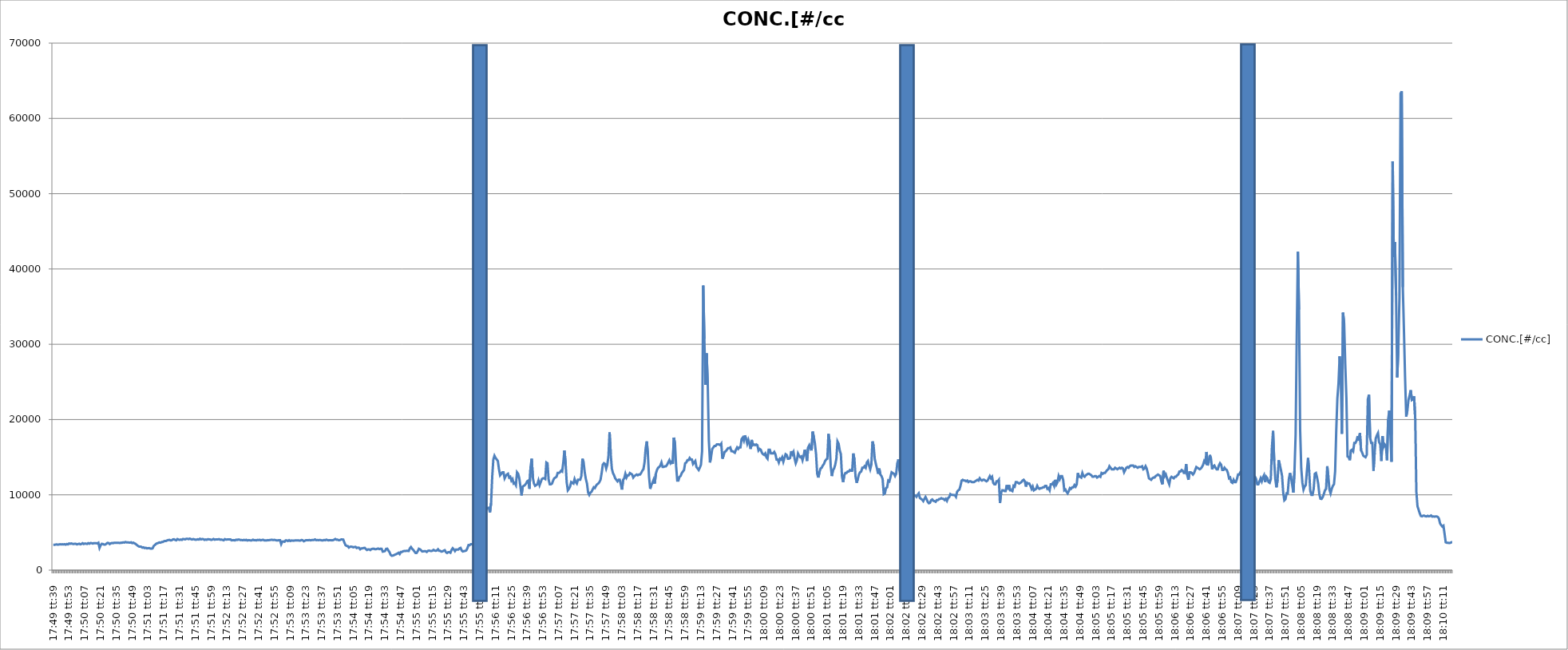
| Category | CONC.[#/cc] |
|---|---|
| 0.7428125 | 3360 |
| 0.7428240740740741 | 3360 |
| 0.7428356481481481 | 3400 |
| 0.7428472222222222 | 3420 |
| 0.7428587962962964 | 3380 |
| 0.7428703703703704 | 3410 |
| 0.7428819444444444 | 3440 |
| 0.7428935185185185 | 3420 |
| 0.7429050925925926 | 3440 |
| 0.7429166666666666 | 3410 |
| 0.7429282407407407 | 3450 |
| 0.7429398148148149 | 3390 |
| 0.7429513888888889 | 3470 |
| 0.7429629629629629 | 3420 |
| 0.742974537037037 | 3540 |
| 0.7429861111111111 | 3500 |
| 0.7429976851851853 | 3550 |
| 0.7430092592592592 | 3500 |
| 0.7430208333333334 | 3470 |
| 0.7430324074074074 | 3500 |
| 0.7430439814814815 | 3500 |
| 0.7430555555555555 | 3420 |
| 0.7430671296296296 | 3470 |
| 0.7430787037037038 | 3510 |
| 0.7430902777777778 | 3430 |
| 0.7431018518518518 | 3480 |
| 0.7431134259259259 | 3580 |
| 0.743125 | 3470 |
| 0.743136574074074 | 3540 |
| 0.7431481481481481 | 3510 |
| 0.7431597222222223 | 3480 |
| 0.7431712962962963 | 3590 |
| 0.7431828703703703 | 3510 |
| 0.7431944444444444 | 3600 |
| 0.7432060185185185 | 3590 |
| 0.7432175925925927 | 3530 |
| 0.7432291666666666 | 3590 |
| 0.7432407407407408 | 3570 |
| 0.7432523148148148 | 3580 |
| 0.743263888888889 | 3550 |
| 0.7432754629629629 | 3640 |
| 0.743287037037037 | 2960 |
| 0.7432986111111112 | 3310 |
| 0.7433101851851852 | 3500 |
| 0.7433217592592593 | 3470 |
| 0.7433333333333333 | 3400 |
| 0.7433449074074074 | 3400 |
| 0.7433564814814814 | 3490 |
| 0.7433680555555555 | 3620 |
| 0.7433796296296297 | 3610 |
| 0.7433912037037037 | 3460 |
| 0.7434027777777777 | 3560 |
| 0.7434143518518518 | 3610 |
| 0.7434259259259259 | 3580 |
| 0.7434375000000001 | 3640 |
| 0.743449074074074 | 3620 |
| 0.7434606481481482 | 3640 |
| 0.7434722222222222 | 3620 |
| 0.7434837962962964 | 3640 |
| 0.7434953703703703 | 3600 |
| 0.7435069444444444 | 3650 |
| 0.7435185185185186 | 3640 |
| 0.7435300925925926 | 3690 |
| 0.7435416666666667 | 3660 |
| 0.7435532407407407 | 3740 |
| 0.7435648148148148 | 3690 |
| 0.743576388888889 | 3690 |
| 0.7435879629629629 | 3670 |
| 0.7435995370370371 | 3650 |
| 0.7436111111111111 | 3700 |
| 0.7436226851851853 | 3590 |
| 0.7436342592592592 | 3650 |
| 0.7436458333333333 | 3560 |
| 0.7436574074074075 | 3490 |
| 0.7436689814814814 | 3350 |
| 0.7436805555555556 | 3230 |
| 0.7436921296296296 | 3140 |
| 0.7437037037037038 | 3130 |
| 0.7437152777777777 | 3100 |
| 0.7437268518518518 | 2990 |
| 0.743738425925926 | 3030 |
| 0.74375 | 2930 |
| 0.7437615740740741 | 2970 |
| 0.7437731481481481 | 2890 |
| 0.7437847222222222 | 2920 |
| 0.7437962962962964 | 2930 |
| 0.7438078703703703 | 2870 |
| 0.7438194444444445 | 2850 |
| 0.7438310185185185 | 2890 |
| 0.7438425925925927 | 3200 |
| 0.7438541666666666 | 3340 |
| 0.7438657407407407 | 3490 |
| 0.7438773148148149 | 3560 |
| 0.7438888888888888 | 3610 |
| 0.743900462962963 | 3680 |
| 0.743912037037037 | 3650 |
| 0.7439236111111112 | 3730 |
| 0.7439351851851851 | 3740 |
| 0.7439467592592592 | 3830 |
| 0.7439583333333334 | 3880 |
| 0.7439699074074074 | 3880 |
| 0.7439814814814815 | 3960 |
| 0.7439930555555555 | 4000 |
| 0.7440046296296297 | 4020 |
| 0.7440162037037038 | 3950 |
| 0.7440277777777777 | 3970 |
| 0.7440393518518519 | 4080 |
| 0.7440509259259259 | 4100 |
| 0.7440625000000001 | 4010 |
| 0.744074074074074 | 3960 |
| 0.7440856481481481 | 4130 |
| 0.7440972222222223 | 4060 |
| 0.7441087962962962 | 4020 |
| 0.7441203703703704 | 4070 |
| 0.7441319444444444 | 4020 |
| 0.7441435185185186 | 4140 |
| 0.7441550925925925 | 4110 |
| 0.7441666666666666 | 4090 |
| 0.7441782407407408 | 4170 |
| 0.7441898148148148 | 4160 |
| 0.7442013888888889 | 4120 |
| 0.7442129629629629 | 4190 |
| 0.7442245370370371 | 4120 |
| 0.7442361111111112 | 4070 |
| 0.7442476851851851 | 4130 |
| 0.7442592592592593 | 4090 |
| 0.7442708333333333 | 4040 |
| 0.7442824074074075 | 4050 |
| 0.7442939814814814 | 4100 |
| 0.7443055555555556 | 4060 |
| 0.7443171296296297 | 4170 |
| 0.7443287037037036 | 4080 |
| 0.7443402777777778 | 4130 |
| 0.7443518518518518 | 4120 |
| 0.744363425925926 | 4020 |
| 0.7443749999999999 | 4070 |
| 0.744386574074074 | 4030 |
| 0.7443981481481482 | 4110 |
| 0.7444097222222222 | 4090 |
| 0.7444212962962963 | 4080 |
| 0.7444328703703703 | 4020 |
| 0.7444444444444445 | 4060 |
| 0.7444560185185186 | 4140 |
| 0.7444675925925925 | 4050 |
| 0.7444791666666667 | 4080 |
| 0.7444907407407407 | 4070 |
| 0.7445023148148149 | 4090 |
| 0.7445138888888888 | 4120 |
| 0.744525462962963 | 4040 |
| 0.7445370370370371 | 4070 |
| 0.744548611111111 | 4020 |
| 0.7445601851851852 | 3970 |
| 0.7445717592592592 | 4120 |
| 0.7445833333333334 | 4070 |
| 0.7445949074074073 | 4070 |
| 0.7446064814814815 | 4090 |
| 0.7446180555555556 | 4070 |
| 0.7446296296296296 | 4090 |
| 0.7446412037037037 | 3960 |
| 0.7446527777777777 | 3970 |
| 0.7446643518518519 | 3990 |
| 0.744675925925926 | 3950 |
| 0.7446875 | 4040 |
| 0.7446990740740741 | 4010 |
| 0.7447106481481481 | 4070 |
| 0.7447222222222223 | 4050 |
| 0.7447337962962962 | 3990 |
| 0.7447453703703704 | 4000 |
| 0.7447569444444445 | 3970 |
| 0.7447685185185186 | 4020 |
| 0.7447800925925926 | 3970 |
| 0.7447916666666666 | 4030 |
| 0.7448032407407408 | 3940 |
| 0.7448148148148147 | 3990 |
| 0.7448263888888889 | 3970 |
| 0.744837962962963 | 3950 |
| 0.744849537037037 | 3960 |
| 0.7448611111111111 | 4040 |
| 0.7448726851851851 | 3970 |
| 0.7448842592592593 | 3990 |
| 0.7448958333333334 | 3950 |
| 0.7449074074074074 | 4020 |
| 0.7449189814814815 | 3990 |
| 0.7449305555555555 | 4030 |
| 0.7449421296296297 | 3960 |
| 0.7449537037037036 | 4010 |
| 0.7449652777777778 | 4030 |
| 0.7449768518518519 | 3950 |
| 0.744988425925926 | 3940 |
| 0.745 | 3940 |
| 0.745011574074074 | 3990 |
| 0.7450231481481482 | 3970 |
| 0.7450347222222223 | 4010 |
| 0.7450462962962963 | 4020 |
| 0.7450578703703704 | 4020 |
| 0.7450694444444445 | 4010 |
| 0.7450810185185185 | 4020 |
| 0.7450925925925925 | 3990 |
| 0.7451041666666667 | 3950 |
| 0.7451157407407408 | 3950 |
| 0.7451273148148148 | 3990 |
| 0.7451388888888889 | 3990 |
| 0.745150462962963 | 3460 |
| 0.7451620370370371 | 3790 |
| 0.745173611111111 | 3810 |
| 0.7451851851851852 | 3770 |
| 0.7451967592592593 | 3960 |
| 0.7452083333333334 | 3950 |
| 0.7452199074074074 | 3870 |
| 0.7452314814814814 | 3980 |
| 0.7452430555555556 | 3870 |
| 0.7452546296296297 | 3940 |
| 0.7452662037037037 | 3920 |
| 0.7452777777777778 | 3910 |
| 0.7452893518518519 | 3940 |
| 0.7453009259259259 | 3940 |
| 0.7453124999999999 | 3940 |
| 0.7453240740740741 | 3960 |
| 0.7453356481481482 | 3930 |
| 0.7453472222222222 | 3930 |
| 0.7453587962962963 | 4000 |
| 0.7453703703703703 | 3980 |
| 0.7453819444444445 | 3840 |
| 0.7453935185185184 | 3910 |
| 0.7454050925925926 | 3990 |
| 0.7454166666666667 | 3990 |
| 0.7454282407407408 | 3980 |
| 0.7454398148148148 | 4000 |
| 0.7454513888888888 | 3960 |
| 0.745462962962963 | 3990 |
| 0.7454745370370371 | 4000 |
| 0.7454861111111111 | 4010 |
| 0.7454976851851852 | 4080 |
| 0.7455092592592593 | 3980 |
| 0.7455208333333333 | 4000 |
| 0.7455324074074073 | 3980 |
| 0.7455439814814815 | 4010 |
| 0.7455555555555556 | 3990 |
| 0.7455671296296296 | 3950 |
| 0.7455787037037037 | 3950 |
| 0.7455902777777778 | 4010 |
| 0.7456018518518519 | 3970 |
| 0.7456134259259258 | 4050 |
| 0.745625 | 3990 |
| 0.7456365740740741 | 3960 |
| 0.7456481481481482 | 3980 |
| 0.7456597222222222 | 3990 |
| 0.7456712962962962 | 3960 |
| 0.7456828703703704 | 3980 |
| 0.7456944444444445 | 4050 |
| 0.7457060185185185 | 4140 |
| 0.7457175925925926 | 4040 |
| 0.7457291666666667 | 4050 |
| 0.7457407407407407 | 3970 |
| 0.7457523148148147 | 3990 |
| 0.7457638888888889 | 4070 |
| 0.745775462962963 | 4080 |
| 0.745787037037037 | 4060 |
| 0.7457986111111111 | 3660 |
| 0.7458101851851852 | 3320 |
| 0.7458217592592593 | 3220 |
| 0.7458333333333332 | 3190 |
| 0.7458449074074074 | 3000 |
| 0.7458564814814815 | 3110 |
| 0.7458680555555556 | 3120 |
| 0.7458796296296296 | 3090 |
| 0.7458912037037037 | 3030 |
| 0.7459027777777778 | 3080 |
| 0.745914351851852 | 3090 |
| 0.7459259259259259 | 2940 |
| 0.7459375 | 2990 |
| 0.7459490740740741 | 2970 |
| 0.7459606481481481 | 2770 |
| 0.7459722222222221 | 2890 |
| 0.7459837962962963 | 2890 |
| 0.7459953703703704 | 2940 |
| 0.7460069444444444 | 2960 |
| 0.7460185185185185 | 2810 |
| 0.7460300925925926 | 2680 |
| 0.7460416666666667 | 2750 |
| 0.7460532407407406 | 2750 |
| 0.7460648148148148 | 2670 |
| 0.7460763888888889 | 2800 |
| 0.746087962962963 | 2840 |
| 0.746099537037037 | 2850 |
| 0.7461111111111111 | 2790 |
| 0.7461226851851852 | 2790 |
| 0.7461342592592594 | 2830 |
| 0.7461458333333333 | 2870 |
| 0.7461574074074074 | 2790 |
| 0.7461689814814815 | 2850 |
| 0.7461805555555556 | 2840 |
| 0.7461921296296296 | 2460 |
| 0.7462037037037037 | 2490 |
| 0.7462152777777779 | 2540 |
| 0.7462268518518519 | 2830 |
| 0.7462384259259259 | 2850 |
| 0.74625 | 2600 |
| 0.7462615740740741 | 2390 |
| 0.746273148148148 | 2030 |
| 0.7462847222222222 | 1910 |
| 0.7462962962962963 | 1940 |
| 0.7463078703703704 | 2000 |
| 0.7463194444444444 | 2070 |
| 0.7463310185185185 | 2130 |
| 0.7463425925925926 | 2210 |
| 0.7463541666666668 | 2310 |
| 0.7463657407407407 | 2140 |
| 0.7463773148148148 | 2420 |
| 0.7463888888888889 | 2410 |
| 0.746400462962963 | 2510 |
| 0.746412037037037 | 2540 |
| 0.7464236111111111 | 2550 |
| 0.7464351851851853 | 2560 |
| 0.7464467592592593 | 2560 |
| 0.7464583333333333 | 2540 |
| 0.7464699074074074 | 2890 |
| 0.7464814814814815 | 3070 |
| 0.7464930555555555 | 2850 |
| 0.7465046296296296 | 2700 |
| 0.7465162037037038 | 2490 |
| 0.7465277777777778 | 2290 |
| 0.7465393518518518 | 2290 |
| 0.7465509259259259 | 2520 |
| 0.7465625 | 2840 |
| 0.7465740740740742 | 2770 |
| 0.7465856481481481 | 2640 |
| 0.7465972222222222 | 2480 |
| 0.7466087962962963 | 2500 |
| 0.7466203703703704 | 2520 |
| 0.7466319444444444 | 2510 |
| 0.7466435185185185 | 2420 |
| 0.7466550925925927 | 2560 |
| 0.7466666666666667 | 2600 |
| 0.7466782407407407 | 2560 |
| 0.7466898148148148 | 2540 |
| 0.7467013888888889 | 2580 |
| 0.7467129629629629 | 2700 |
| 0.746724537037037 | 2600 |
| 0.7467361111111112 | 2570 |
| 0.7467476851851852 | 2620 |
| 0.7467592592592592 | 2770 |
| 0.7467708333333333 | 2560 |
| 0.7467824074074074 | 2560 |
| 0.7467939814814816 | 2460 |
| 0.7468055555555555 | 2500 |
| 0.7468171296296297 | 2590 |
| 0.7468287037037037 | 2650 |
| 0.7468402777777778 | 2380 |
| 0.7468518518518518 | 2280 |
| 0.7468634259259259 | 2380 |
| 0.7468750000000001 | 2390 |
| 0.7468865740740741 | 2310 |
| 0.7468981481481481 | 2690 |
| 0.7469097222222222 | 2910 |
| 0.7469212962962963 | 2750 |
| 0.7469328703703703 | 2530 |
| 0.7469444444444444 | 2740 |
| 0.7469560185185186 | 2730 |
| 0.7469675925925926 | 2740 |
| 0.7469791666666666 | 2900 |
| 0.7469907407407407 | 2950 |
| 0.7470023148148148 | 2600 |
| 0.747013888888889 | 2480 |
| 0.7470254629629629 | 2530 |
| 0.747037037037037 | 2550 |
| 0.7470486111111111 | 2620 |
| 0.7470601851851852 | 2900 |
| 0.7470717592592592 | 3330 |
| 0.7470833333333333 | 3310 |
| 0.7470949074074075 | 3450 |
| 0.7471064814814815 | 3440 |
| 0.7471180555555555 | 3400 |
| 0.7471296296296296 | 3250 |
| 0.7471412037037037 | 4040 |
| 0.7471527777777777 | 4210 |
| 0.7471643518518518 | 4040 |
| 0.747175925925926 | 3940 |
| 0.7471875 | 3800 |
| 0.747199074074074 | 3920 |
| 0.7472106481481481 | 5620 |
| 0.7472222222222222 | 6890 |
| 0.7472337962962964 | 7760 |
| 0.7472453703703703 | 8020 |
| 0.7472569444444445 | 8160 |
| 0.7472685185185185 | 8260 |
| 0.7472800925925926 | 8290 |
| 0.7472916666666666 | 7670 |
| 0.7473032407407407 | 8890 |
| 0.7473148148148149 | 12400 |
| 0.7473263888888889 | 14700 |
| 0.747337962962963 | 15200 |
| 0.747349537037037 | 14900 |
| 0.7473611111111111 | 14700 |
| 0.7473726851851853 | 14500 |
| 0.7473842592592592 | 13400 |
| 0.7473958333333334 | 12600 |
| 0.7474074074074074 | 12800 |
| 0.7474189814814814 | 13000 |
| 0.7474305555555555 | 13000 |
| 0.7474421296296296 | 12200 |
| 0.7474537037037038 | 12500 |
| 0.7474652777777777 | 12700 |
| 0.7474768518518519 | 12800 |
| 0.7474884259259259 | 12300 |
| 0.7475 | 12400 |
| 0.747511574074074 | 11900 |
| 0.7475231481481481 | 12100 |
| 0.7475347222222223 | 11500 |
| 0.7475462962962963 | 11600 |
| 0.7475578703703704 | 11300 |
| 0.7475694444444444 | 13000 |
| 0.7475810185185185 | 12800 |
| 0.7475925925925927 | 12200 |
| 0.7476041666666666 | 11100 |
| 0.7476157407407408 | 9930 |
| 0.7476273148148148 | 11100 |
| 0.747638888888889 | 11200 |
| 0.7476504629629629 | 11300 |
| 0.747662037037037 | 11500 |
| 0.7476736111111112 | 11800 |
| 0.7476851851851851 | 11900 |
| 0.7476967592592593 | 10800 |
| 0.7477083333333333 | 13700 |
| 0.7477199074074075 | 14800 |
| 0.7477314814814814 | 12300 |
| 0.7477314814814814 | 11500 |
| 0.7477430555555555 | 11200 |
| 0.7477546296296297 | 11300 |
| 0.7477777777777778 | 11400 |
| 0.7477893518518518 | 11900 |
| 0.747800925925926 | 11300 |
| 0.7478125000000001 | 11700 |
| 0.747824074074074 | 12100 |
| 0.7478356481481482 | 12200 |
| 0.7478472222222222 | 12200 |
| 0.7478587962962964 | 12100 |
| 0.7478703703703703 | 14300 |
| 0.7478819444444444 | 14200 |
| 0.7478935185185186 | 12000 |
| 0.7479050925925925 | 11400 |
| 0.7479166666666667 | 11400 |
| 0.7479282407407407 | 11500 |
| 0.7479398148148149 | 11900 |
| 0.7479513888888888 | 12200 |
| 0.7479629629629629 | 12300 |
| 0.7479745370370371 | 12400 |
| 0.7479861111111111 | 12900 |
| 0.7479976851851852 | 12900 |
| 0.7480092592592592 | 13000 |
| 0.7480208333333334 | 13200 |
| 0.7480324074074075 | 13100 |
| 0.7480439814814814 | 14300 |
| 0.7480555555555556 | 15900 |
| 0.7480671296296296 | 14300 |
| 0.7480787037037038 | 11700 |
| 0.7480902777777777 | 10600 |
| 0.7481018518518519 | 10800 |
| 0.748113425925926 | 11100 |
| 0.7481249999999999 | 11700 |
| 0.7481365740740741 | 11600 |
| 0.7481481481481481 | 11500 |
| 0.7481597222222223 | 12100 |
| 0.7481712962962962 | 11700 |
| 0.7481828703703703 | 11500 |
| 0.7481944444444445 | 12000 |
| 0.7482060185185185 | 12000 |
| 0.7482175925925926 | 12000 |
| 0.7482291666666666 | 12500 |
| 0.7482407407407408 | 14800 |
| 0.7482523148148149 | 14300 |
| 0.7482638888888888 | 13000 |
| 0.748275462962963 | 12100 |
| 0.748287037037037 | 11500 |
| 0.7482986111111112 | 10300 |
| 0.7483101851851851 | 10000 |
| 0.7483217592592593 | 10300 |
| 0.7483333333333334 | 10400 |
| 0.7483449074074073 | 10700 |
| 0.7483564814814815 | 11000 |
| 0.7483680555555555 | 10900 |
| 0.7483796296296297 | 11200 |
| 0.7483912037037036 | 11400 |
| 0.7484027777777778 | 11500 |
| 0.7484143518518519 | 11700 |
| 0.7484259259259259 | 12000 |
| 0.7484375 | 12900 |
| 0.748449074074074 | 14000 |
| 0.7484606481481482 | 14200 |
| 0.7484722222222223 | 14100 |
| 0.7484837962962962 | 13500 |
| 0.7484953703703704 | 14000 |
| 0.7485069444444444 | 15100 |
| 0.7485185185185186 | 18300 |
| 0.7485300925925925 | 15500 |
| 0.7485416666666667 | 13500 |
| 0.7485532407407408 | 12900 |
| 0.7485648148148147 | 12600 |
| 0.7485763888888889 | 12200 |
| 0.7485879629629629 | 12000 |
| 0.7485995370370371 | 11800 |
| 0.748611111111111 | 12000 |
| 0.7486226851851852 | 12000 |
| 0.7486342592592593 | 11400 |
| 0.7486458333333333 | 10700 |
| 0.7486574074074074 | 12000 |
| 0.7486689814814814 | 12200 |
| 0.7486805555555556 | 12800 |
| 0.7486921296296297 | 12300 |
| 0.7487037037037036 | 12600 |
| 0.7487152777777778 | 12600 |
| 0.7487268518518518 | 12900 |
| 0.748738425925926 | 12800 |
| 0.7487499999999999 | 12700 |
| 0.7487615740740741 | 12300 |
| 0.7487731481481482 | 12500 |
| 0.7487847222222223 | 12600 |
| 0.7487962962962963 | 12700 |
| 0.7488078703703703 | 12600 |
| 0.7488194444444445 | 12700 |
| 0.7488310185185186 | 12700 |
| 0.7488425925925926 | 12900 |
| 0.7488541666666667 | 13200 |
| 0.7488657407407407 | 13400 |
| 0.7488773148148148 | 14300 |
| 0.7488888888888888 | 16200 |
| 0.748900462962963 | 17100 |
| 0.7489120370370371 | 15300 |
| 0.748923611111111 | 12400 |
| 0.7489351851851852 | 10800 |
| 0.7489467592592592 | 11300 |
| 0.7489583333333334 | 11600 |
| 0.7489699074074073 | 12000 |
| 0.7489814814814815 | 11500 |
| 0.7489930555555556 | 12800 |
| 0.7490046296296297 | 13300 |
| 0.7490162037037037 | 13600 |
| 0.7490277777777777 | 13700 |
| 0.7490393518518519 | 13900 |
| 0.749050925925926 | 14300 |
| 0.7490625 | 13700 |
| 0.7490740740740741 | 13700 |
| 0.7490856481481482 | 13800 |
| 0.7490972222222222 | 13800 |
| 0.7491087962962962 | 14000 |
| 0.7491203703703704 | 14300 |
| 0.7491319444444445 | 14600 |
| 0.7491435185185185 | 14200 |
| 0.7491550925925926 | 14400 |
| 0.7491666666666666 | 14100 |
| 0.7491782407407408 | 17600 |
| 0.7491898148148147 | 16800 |
| 0.7492013888888889 | 13800 |
| 0.749212962962963 | 11900 |
| 0.7492245370370371 | 11900 |
| 0.7492361111111111 | 12400 |
| 0.7492476851851851 | 12500 |
| 0.7492592592592593 | 12900 |
| 0.7492708333333334 | 13100 |
| 0.7492824074074074 | 13300 |
| 0.7492939814814815 | 14200 |
| 0.7493055555555556 | 14300 |
| 0.7493171296296296 | 14600 |
| 0.7493287037037036 | 14600 |
| 0.7493402777777778 | 14900 |
| 0.7493518518518519 | 14700 |
| 0.7493634259259259 | 14700 |
| 0.749375 | 14100 |
| 0.749386574074074 | 14300 |
| 0.7493981481481482 | 14500 |
| 0.7494097222222221 | 13700 |
| 0.7494212962962963 | 13500 |
| 0.7494328703703704 | 13300 |
| 0.7494444444444445 | 13600 |
| 0.7494560185185185 | 14000 |
| 0.7494675925925925 | 15800 |
| 0.7494791666666667 | 37800 |
| 0.7494907407407408 | 30700 |
| 0.7495023148148148 | 24600 |
| 0.7495138888888889 | 28800 |
| 0.749525462962963 | 24800 |
| 0.749537037037037 | 17200 |
| 0.749548611111111 | 14300 |
| 0.7495601851851852 | 15100 |
| 0.7495717592592593 | 16100 |
| 0.7495833333333333 | 16300 |
| 0.7495949074074074 | 16500 |
| 0.7496064814814815 | 16500 |
| 0.7496180555555556 | 16700 |
| 0.7496296296296295 | 16700 |
| 0.7496412037037037 | 16700 |
| 0.7496527777777778 | 16600 |
| 0.7496643518518519 | 16800 |
| 0.7496759259259259 | 14800 |
| 0.7496875 | 15200 |
| 0.7496990740740741 | 15700 |
| 0.7497106481481483 | 15800 |
| 0.7497222222222222 | 16000 |
| 0.7497337962962963 | 16200 |
| 0.7497453703703704 | 16200 |
| 0.7497569444444444 | 16300 |
| 0.7497685185185184 | 15800 |
| 0.7497800925925926 | 15800 |
| 0.7497916666666667 | 15700 |
| 0.7498032407407407 | 15600 |
| 0.7498148148148148 | 16000 |
| 0.7498263888888889 | 16300 |
| 0.749837962962963 | 16100 |
| 0.7498495370370369 | 16300 |
| 0.7498611111111111 | 16300 |
| 0.7498726851851852 | 17400 |
| 0.7498842592592593 | 17600 |
| 0.7498958333333333 | 17200 |
| 0.7499074074074074 | 17900 |
| 0.7499189814814815 | 17400 |
| 0.7499305555555557 | 16800 |
| 0.7499421296296296 | 17300 |
| 0.7499537037037037 | 16800 |
| 0.7499652777777778 | 16100 |
| 0.7499768518518519 | 17300 |
| 0.7499884259259259 | 16600 |
| 0.75 | 16700 |
| 0.7500115740740741 | 16600 |
| 0.7500231481481481 | 16700 |
| 0.7500347222222222 | 16600 |
| 0.7500462962962963 | 15900 |
| 0.7500578703703704 | 16100 |
| 0.7500694444444443 | 16000 |
| 0.7500810185185185 | 15600 |
| 0.7500925925925926 | 15400 |
| 0.7501041666666667 | 15300 |
| 0.7501157407407407 | 15500 |
| 0.7501273148148148 | 15000 |
| 0.7501388888888889 | 14800 |
| 0.7501504629629631 | 16000 |
| 0.750162037037037 | 16000 |
| 0.7501736111111111 | 15500 |
| 0.7501851851851852 | 15500 |
| 0.7501967592592593 | 15500 |
| 0.7502083333333333 | 15700 |
| 0.7502199074074074 | 15400 |
| 0.7502314814814816 | 14700 |
| 0.7502430555555555 | 14700 |
| 0.7502546296296296 | 14300 |
| 0.7502662037037037 | 14800 |
| 0.7502777777777778 | 14700 |
| 0.7502893518518517 | 15000 |
| 0.7503009259259259 | 14400 |
| 0.7503125 | 14900 |
| 0.7503240740740741 | 15400 |
| 0.7503356481481481 | 15300 |
| 0.7503472222222222 | 14800 |
| 0.7503587962962963 | 14800 |
| 0.7503703703703705 | 14900 |
| 0.7503819444444444 | 15800 |
| 0.7503935185185185 | 15400 |
| 0.7504050925925926 | 15700 |
| 0.7504166666666667 | 14800 |
| 0.7504282407407407 | 14200 |
| 0.7504398148148148 | 14600 |
| 0.750451388888889 | 15500 |
| 0.750462962962963 | 15200 |
| 0.750474537037037 | 15000 |
| 0.7504861111111111 | 15100 |
| 0.7504976851851852 | 14600 |
| 0.7505092592592592 | 15200 |
| 0.7505208333333333 | 16000 |
| 0.7505324074074075 | 15400 |
| 0.7505439814814815 | 14500 |
| 0.7505555555555555 | 16300 |
| 0.7505671296296296 | 16600 |
| 0.7505787037037037 | 16200 |
| 0.7505902777777779 | 15900 |
| 0.7506018518518518 | 18400 |
| 0.750613425925926 | 17700 |
| 0.750625 | 16800 |
| 0.7506365740740741 | 15400 |
| 0.7506481481481481 | 12800 |
| 0.7506597222222222 | 12300 |
| 0.7506712962962964 | 13000 |
| 0.7506828703703704 | 13500 |
| 0.7506944444444444 | 13600 |
| 0.7507060185185185 | 13900 |
| 0.7507175925925926 | 14100 |
| 0.7507291666666666 | 14500 |
| 0.7507407407407407 | 14700 |
| 0.7507523148148149 | 14800 |
| 0.7507638888888889 | 18100 |
| 0.7507754629629629 | 17000 |
| 0.750787037037037 | 13800 |
| 0.7507986111111111 | 12500 |
| 0.7508101851851853 | 13300 |
| 0.7508217592592592 | 13500 |
| 0.7508333333333334 | 14000 |
| 0.7508449074074074 | 14800 |
| 0.7508564814814815 | 17100 |
| 0.7508680555555555 | 16800 |
| 0.7508796296296296 | 15900 |
| 0.7508912037037038 | 15400 |
| 0.7509027777777778 | 12400 |
| 0.7509143518518518 | 11700 |
| 0.7509259259259259 | 12600 |
| 0.7509375 | 12900 |
| 0.750949074074074 | 12900 |
| 0.7509606481481481 | 13100 |
| 0.7509722222222223 | 13100 |
| 0.7509837962962963 | 13300 |
| 0.7509953703703703 | 13200 |
| 0.7510069444444444 | 13200 |
| 0.7510185185185185 | 15500 |
| 0.7510300925925927 | 14700 |
| 0.7510416666666666 | 12400 |
| 0.7510532407407408 | 11600 |
| 0.7510648148148148 | 12100 |
| 0.751076388888889 | 12700 |
| 0.7510879629629629 | 13000 |
| 0.751099537037037 | 13100 |
| 0.7511111111111112 | 13600 |
| 0.7511226851851852 | 13600 |
| 0.7511342592592593 | 13800 |
| 0.7511458333333333 | 13600 |
| 0.7511574074074074 | 14300 |
| 0.7511689814814816 | 14500 |
| 0.7511805555555555 | 13900 |
| 0.7511921296296297 | 13400 |
| 0.7512037037037037 | 14000 |
| 0.7512152777777777 | 17100 |
| 0.7512268518518518 | 16500 |
| 0.7512384259259259 | 14800 |
| 0.7512500000000001 | 14100 |
| 0.751261574074074 | 13500 |
| 0.7512731481481482 | 12800 |
| 0.7512847222222222 | 13500 |
| 0.7512962962962964 | 12700 |
| 0.7513078703703703 | 12500 |
| 0.7513194444444444 | 12100 |
| 0.7513310185185186 | 10100 |
| 0.7513425925925926 | 10200 |
| 0.7513541666666667 | 10900 |
| 0.7513657407407407 | 11000 |
| 0.7513773148148148 | 11900 |
| 0.751388888888889 | 11800 |
| 0.7514004629629629 | 12400 |
| 0.7514120370370371 | 13000 |
| 0.7514236111111111 | 12900 |
| 0.7514351851851852 | 12800 |
| 0.7514467592592592 | 12500 |
| 0.7514583333333333 | 12800 |
| 0.7514699074074075 | 14200 |
| 0.7514814814814814 | 14700 |
| 0.7514930555555556 | 13200 |
| 0.7515046296296296 | 12000 |
| 0.7515162037037038 | 11500 |
| 0.7515277777777777 | 11400 |
| 0.7515393518518518 | 10600 |
| 0.751550925925926 | 10700 |
| 0.7515625 | 10600 |
| 0.7515740740740741 | 10700 |
| 0.7515856481481481 | 10500 |
| 0.7515972222222222 | 10500 |
| 0.7516087962962964 | 10400 |
| 0.7516203703703703 | 10400 |
| 0.7516319444444445 | 10100 |
| 0.7516435185185185 | 9890 |
| 0.7516550925925927 | 9920 |
| 0.7516666666666666 | 9740 |
| 0.7516782407407407 | 10000 |
| 0.7516898148148149 | 10200 |
| 0.7517013888888888 | 9590 |
| 0.751712962962963 | 9470 |
| 0.751724537037037 | 9360 |
| 0.7517361111111112 | 9170 |
| 0.7517476851851851 | 9460 |
| 0.7517592592592592 | 9720 |
| 0.7517708333333334 | 9420 |
| 0.7517824074074074 | 9060 |
| 0.7517939814814815 | 8890 |
| 0.7518055555555555 | 8950 |
| 0.7518171296296297 | 9300 |
| 0.7518287037037038 | 9390 |
| 0.7518402777777777 | 9210 |
| 0.7518518518518519 | 9160 |
| 0.7518634259259259 | 9080 |
| 0.7518750000000001 | 9310 |
| 0.751886574074074 | 9300 |
| 0.7518981481481481 | 9440 |
| 0.7519097222222223 | 9460 |
| 0.7519212962962962 | 9560 |
| 0.7519328703703704 | 9480 |
| 0.7519444444444444 | 9470 |
| 0.7519560185185186 | 9310 |
| 0.7519675925925925 | 9470 |
| 0.7519791666666666 | 9200 |
| 0.7519907407407408 | 9570 |
| 0.7520023148148148 | 9700 |
| 0.7520138888888889 | 10100 |
| 0.7520254629629629 | 10000 |
| 0.7520370370370371 | 10000 |
| 0.7520486111111112 | 9970 |
| 0.7520601851851851 | 9960 |
| 0.7520717592592593 | 9740 |
| 0.7520833333333333 | 10400 |
| 0.7520949074074075 | 10600 |
| 0.7521064814814814 | 10700 |
| 0.7521180555555556 | 11200 |
| 0.7521296296296297 | 11900 |
| 0.7521412037037036 | 12000 |
| 0.7521527777777778 | 11900 |
| 0.7521643518518518 | 11900 |
| 0.752175925925926 | 11800 |
| 0.7521874999999999 | 11900 |
| 0.752199074074074 | 11700 |
| 0.7522106481481482 | 11800 |
| 0.7522222222222222 | 11800 |
| 0.7522337962962963 | 11700 |
| 0.7522453703703703 | 11700 |
| 0.7522569444444445 | 11700 |
| 0.7522685185185186 | 11800 |
| 0.7522800925925925 | 11900 |
| 0.7522916666666667 | 12000 |
| 0.7523032407407407 | 11900 |
| 0.7523148148148149 | 12200 |
| 0.7523263888888888 | 12000 |
| 0.752337962962963 | 11900 |
| 0.7523495370370371 | 12000 |
| 0.7523611111111111 | 12000 |
| 0.7523726851851852 | 11900 |
| 0.7523842592592592 | 11800 |
| 0.7523958333333334 | 11900 |
| 0.7524074074074073 | 12200 |
| 0.7524189814814815 | 12500 |
| 0.7524305555555556 | 12200 |
| 0.7524421296296296 | 12400 |
| 0.7524537037037037 | 11600 |
| 0.7524652777777777 | 11400 |
| 0.7524768518518519 | 11400 |
| 0.752488425925926 | 11800 |
| 0.7525 | 11800 |
| 0.7525115740740741 | 12000 |
| 0.7525231481481481 | 8910 |
| 0.7525347222222223 | 10300 |
| 0.7525462962962962 | 10600 |
| 0.7525578703703704 | 10600 |
| 0.7525694444444445 | 10500 |
| 0.7525810185185186 | 10500 |
| 0.7525925925925926 | 11300 |
| 0.7526041666666666 | 10700 |
| 0.7526157407407408 | 11300 |
| 0.7526273148148147 | 10600 |
| 0.7526388888888889 | 10600 |
| 0.752650462962963 | 10500 |
| 0.752662037037037 | 11200 |
| 0.7526736111111111 | 11100 |
| 0.7526851851851851 | 11700 |
| 0.7526967592592593 | 11700 |
| 0.7527083333333334 | 11600 |
| 0.7527199074074074 | 11500 |
| 0.7527314814814815 | 11600 |
| 0.7527430555555555 | 11700 |
| 0.7527546296296297 | 11900 |
| 0.7527662037037036 | 12000 |
| 0.7527777777777778 | 11800 |
| 0.7527893518518519 | 11100 |
| 0.752800925925926 | 11600 |
| 0.7528125 | 11500 |
| 0.752824074074074 | 11500 |
| 0.7528356481481482 | 11200 |
| 0.7528472222222221 | 10800 |
| 0.7528587962962963 | 11100 |
| 0.7528703703703704 | 10600 |
| 0.7528819444444445 | 10700 |
| 0.7528935185185185 | 10800 |
| 0.7529050925925925 | 11200 |
| 0.7529166666666667 | 10900 |
| 0.7529282407407408 | 10800 |
| 0.7529398148148148 | 10900 |
| 0.7529513888888889 | 10900 |
| 0.752962962962963 | 11000 |
| 0.7529745370370371 | 11000 |
| 0.752986111111111 | 11200 |
| 0.7529976851851852 | 11200 |
| 0.7530092592592593 | 10800 |
| 0.7530208333333334 | 10900 |
| 0.7530324074074074 | 10600 |
| 0.7530439814814814 | 11400 |
| 0.7530555555555556 | 11400 |
| 0.7530671296296297 | 11600 |
| 0.7530787037037037 | 11200 |
| 0.7530902777777778 | 12000 |
| 0.7531018518518519 | 11400 |
| 0.7531134259259259 | 11700 |
| 0.7531249999999999 | 12500 |
| 0.7531365740740741 | 12100 |
| 0.7531481481481482 | 12500 |
| 0.7531597222222222 | 12500 |
| 0.7531712962962963 | 12000 |
| 0.7531828703703703 | 10600 |
| 0.7531944444444445 | 10700 |
| 0.7532060185185184 | 10400 |
| 0.7532175925925926 | 10200 |
| 0.7532291666666667 | 10500 |
| 0.7532407407407408 | 10900 |
| 0.7532523148148148 | 10800 |
| 0.7532638888888888 | 11000 |
| 0.753275462962963 | 11000 |
| 0.7532870370370371 | 11300 |
| 0.7532986111111111 | 11100 |
| 0.7533101851851852 | 11400 |
| 0.7533217592592593 | 12900 |
| 0.7533333333333333 | 12400 |
| 0.7533449074074073 | 12400 |
| 0.7533564814814815 | 12300 |
| 0.7533680555555556 | 12900 |
| 0.7533796296296296 | 12500 |
| 0.7533912037037037 | 12400 |
| 0.7534027777777778 | 12600 |
| 0.7534143518518519 | 12700 |
| 0.7534259259259258 | 12800 |
| 0.7534375 | 12800 |
| 0.7534490740740741 | 12700 |
| 0.7534606481481482 | 12600 |
| 0.7534722222222222 | 12400 |
| 0.7534837962962962 | 12400 |
| 0.7534953703703704 | 12500 |
| 0.7535069444444445 | 12500 |
| 0.7535185185185185 | 12300 |
| 0.7535300925925926 | 12400 |
| 0.7535416666666667 | 12500 |
| 0.7535532407407407 | 12400 |
| 0.7535648148148147 | 12900 |
| 0.7535763888888889 | 12800 |
| 0.753587962962963 | 12900 |
| 0.753599537037037 | 12900 |
| 0.7536111111111111 | 13100 |
| 0.7536226851851852 | 13300 |
| 0.7536342592592593 | 13400 |
| 0.7536458333333332 | 13800 |
| 0.7536574074074074 | 13600 |
| 0.7536689814814815 | 13400 |
| 0.7536805555555556 | 13400 |
| 0.7536921296296296 | 13400 |
| 0.7537037037037037 | 13600 |
| 0.7537152777777778 | 13500 |
| 0.753726851851852 | 13400 |
| 0.7537384259259259 | 13500 |
| 0.75375 | 13600 |
| 0.7537615740740741 | 13500 |
| 0.7537731481481482 | 13600 |
| 0.7537847222222221 | 13500 |
| 0.7537962962962963 | 13000 |
| 0.7538078703703704 | 13300 |
| 0.7538194444444444 | 13600 |
| 0.7538310185185185 | 13700 |
| 0.7538425925925926 | 13600 |
| 0.7538541666666667 | 13800 |
| 0.7538657407407406 | 13900 |
| 0.7538773148148148 | 13900 |
| 0.7538888888888889 | 13900 |
| 0.753900462962963 | 13700 |
| 0.753912037037037 | 13800 |
| 0.7539236111111111 | 13700 |
| 0.7539351851851852 | 13600 |
| 0.7539467592592594 | 13700 |
| 0.7539583333333333 | 13700 |
| 0.7539699074074074 | 13700 |
| 0.7539814814814815 | 13800 |
| 0.7539930555555556 | 13400 |
| 0.7540046296296296 | 13500 |
| 0.7540162037037037 | 13800 |
| 0.7540277777777779 | 13500 |
| 0.7540393518518518 | 12900 |
| 0.7540509259259259 | 12200 |
| 0.7540625 | 12100 |
| 0.7540740740740741 | 12000 |
| 0.754085648148148 | 12200 |
| 0.7540972222222222 | 12300 |
| 0.7541087962962963 | 12300 |
| 0.7541203703703704 | 12500 |
| 0.7541319444444444 | 12600 |
| 0.7541435185185185 | 12700 |
| 0.7541550925925926 | 12600 |
| 0.7541666666666668 | 12500 |
| 0.7541782407407407 | 11800 |
| 0.7541898148148148 | 11400 |
| 0.7542013888888889 | 13200 |
| 0.754212962962963 | 12500 |
| 0.754224537037037 | 12700 |
| 0.7542361111111111 | 12200 |
| 0.7542476851851853 | 11800 |
| 0.7542592592592593 | 11400 |
| 0.7542708333333333 | 12200 |
| 0.7542824074074074 | 12400 |
| 0.7542939814814815 | 12300 |
| 0.7543055555555555 | 12200 |
| 0.7543171296296296 | 12400 |
| 0.7543287037037038 | 12400 |
| 0.7543402777777778 | 12600 |
| 0.7543518518518518 | 12700 |
| 0.7543634259259259 | 13100 |
| 0.754375 | 13100 |
| 0.7543865740740742 | 13300 |
| 0.7543981481481481 | 13200 |
| 0.7544097222222222 | 12900 |
| 0.7544212962962963 | 12900 |
| 0.7544328703703704 | 14100 |
| 0.7544444444444444 | 12600 |
| 0.7544560185185185 | 12000 |
| 0.7544675925925927 | 13000 |
| 0.7544791666666667 | 13000 |
| 0.7544907407407407 | 12900 |
| 0.7545023148148148 | 12700 |
| 0.7545138888888889 | 12900 |
| 0.7545254629629629 | 13300 |
| 0.754537037037037 | 13700 |
| 0.7545486111111112 | 13600 |
| 0.7545601851851852 | 13500 |
| 0.7545717592592592 | 13400 |
| 0.7545833333333333 | 13500 |
| 0.7545949074074074 | 13700 |
| 0.7546064814814816 | 14000 |
| 0.7546180555555555 | 14500 |
| 0.7546296296296297 | 14300 |
| 0.7546412037037037 | 15700 |
| 0.7546527777777778 | 13900 |
| 0.7546643518518518 | 14400 |
| 0.7546759259259259 | 15300 |
| 0.7546875000000001 | 14800 |
| 0.7546990740740741 | 13400 |
| 0.7547106481481481 | 13800 |
| 0.7547222222222222 | 13900 |
| 0.7547337962962963 | 13600 |
| 0.7547453703703703 | 13400 |
| 0.7547569444444444 | 13400 |
| 0.7547685185185186 | 13900 |
| 0.7547800925925926 | 14200 |
| 0.7547916666666666 | 14000 |
| 0.7548032407407407 | 13300 |
| 0.7548148148148148 | 13300 |
| 0.754826388888889 | 13600 |
| 0.7548379629629629 | 13400 |
| 0.754849537037037 | 13300 |
| 0.7548611111111111 | 12900 |
| 0.7548726851851852 | 12200 |
| 0.7548842592592592 | 12300 |
| 0.7548958333333333 | 11700 |
| 0.7549074074074075 | 11600 |
| 0.7549189814814815 | 12000 |
| 0.7549305555555555 | 11700 |
| 0.7549421296296296 | 11700 |
| 0.7549537037037037 | 12100 |
| 0.7549652777777779 | 12700 |
| 0.7549768518518518 | 12700 |
| 0.754988425925926 | 13000 |
| 0.755 | 12900 |
| 0.755011574074074 | 13300 |
| 0.7550231481481481 | 13100 |
| 0.7550347222222222 | 12700 |
| 0.7550462962962964 | 13200 |
| 0.7550578703703703 | 11900 |
| 0.7550694444444445 | 10300 |
| 0.7550810185185185 | 9740 |
| 0.7550925925925926 | 10900 |
| 0.7551041666666666 | 11700 |
| 0.7551157407407407 | 12400 |
| 0.7551273148148149 | 12500 |
| 0.7551388888888889 | 12400 |
| 0.755150462962963 | 12100 |
| 0.755162037037037 | 11400 |
| 0.7551736111111111 | 11400 |
| 0.7551851851851853 | 11800 |
| 0.7551967592592592 | 12200 |
| 0.7552083333333334 | 11800 |
| 0.7552199074074074 | 12300 |
| 0.7552314814814814 | 12600 |
| 0.7552430555555555 | 11700 |
| 0.7552546296296296 | 12400 |
| 0.7552662037037038 | 12200 |
| 0.7552777777777777 | 11700 |
| 0.7552893518518519 | 11600 |
| 0.7553009259259259 | 12100 |
| 0.7553125 | 16300 |
| 0.755324074074074 | 18500 |
| 0.7553356481481481 | 14500 |
| 0.7553472222222223 | 12100 |
| 0.7553587962962963 | 11000 |
| 0.7553703703703704 | 12000 |
| 0.7553819444444444 | 14600 |
| 0.7553935185185185 | 14000 |
| 0.7554050925925927 | 13300 |
| 0.7554166666666666 | 12500 |
| 0.7554282407407408 | 10300 |
| 0.7554398148148148 | 9280 |
| 0.7554513888888889 | 9430 |
| 0.7554629629629629 | 10200 |
| 0.755474537037037 | 10200 |
| 0.7554861111111112 | 12100 |
| 0.7554976851851851 | 12900 |
| 0.7555092592592593 | 12300 |
| 0.7555208333333333 | 11300 |
| 0.7555324074074075 | 10300 |
| 0.7555439814814814 | 13200 |
| 0.7555555555555555 | 18000 |
| 0.7555671296296297 | 31200 |
| 0.7555787037037037 | 42300 |
| 0.7555902777777778 | 34600 |
| 0.7556018518518518 | 18600 |
| 0.755613425925926 | 13500 |
| 0.7556250000000001 | 11600 |
| 0.755636574074074 | 10700 |
| 0.7556481481481482 | 11100 |
| 0.7556597222222222 | 11300 |
| 0.7556712962962964 | 13200 |
| 0.7556828703703703 | 14900 |
| 0.7556944444444444 | 13100 |
| 0.7557060185185186 | 10500 |
| 0.7557175925925925 | 10000 |
| 0.7557291666666667 | 10000 |
| 0.7557407407407407 | 10800 |
| 0.7557523148148149 | 12800 |
| 0.7557638888888888 | 12900 |
| 0.7557754629629629 | 12300 |
| 0.7557870370370371 | 11500 |
| 0.7557986111111111 | 10100 |
| 0.7558101851851852 | 9490 |
| 0.7558217592592592 | 9460 |
| 0.7558333333333334 | 9690 |
| 0.7558449074074075 | 10100 |
| 0.7558564814814814 | 10600 |
| 0.7558680555555556 | 10800 |
| 0.7558796296296296 | 13800 |
| 0.7558912037037038 | 12400 |
| 0.7559027777777777 | 10700 |
| 0.7559143518518519 | 10200 |
| 0.755925925925926 | 10800 |
| 0.7559374999999999 | 11200 |
| 0.7559490740740741 | 11400 |
| 0.7559606481481481 | 13100 |
| 0.7559722222222223 | 18500 |
| 0.7559837962962962 | 22800 |
| 0.7559953703703703 | 24800 |
| 0.7560069444444445 | 28400 |
| 0.7560185185185185 | 25800 |
| 0.7560300925925926 | 18100 |
| 0.7560416666666666 | 34200 |
| 0.7560532407407408 | 32800 |
| 0.7560648148148149 | 27300 |
| 0.7560763888888888 | 22900 |
| 0.756087962962963 | 15100 |
| 0.756099537037037 | 15000 |
| 0.7561111111111112 | 14600 |
| 0.7561226851851851 | 15900 |
| 0.7561342592592593 | 16000 |
| 0.7561458333333334 | 15800 |
| 0.7561574074074073 | 16900 |
| 0.7561689814814815 | 16900 |
| 0.7561805555555555 | 17200 |
| 0.7561921296296297 | 17800 |
| 0.7562037037037036 | 17200 |
| 0.7562152777777778 | 18200 |
| 0.7562268518518519 | 15900 |
| 0.7562384259259259 | 15600 |
| 0.75625 | 15200 |
| 0.756261574074074 | 15100 |
| 0.7562731481481482 | 15000 |
| 0.7562847222222223 | 15300 |
| 0.7562962962962962 | 22700 |
| 0.7563078703703704 | 23300 |
| 0.7563194444444444 | 17600 |
| 0.7563310185185186 | 16900 |
| 0.7563425925925925 | 16900 |
| 0.7563541666666667 | 13200 |
| 0.7563657407407408 | 15600 |
| 0.7563773148148148 | 17500 |
| 0.7563888888888889 | 17900 |
| 0.7564004629629629 | 18200 |
| 0.7564120370370371 | 17000 |
| 0.756423611111111 | 16700 |
| 0.7564351851851852 | 14500 |
| 0.7564467592592593 | 17800 |
| 0.7564583333333333 | 16400 |
| 0.7564699074074074 | 16700 |
| 0.7564814814814814 | 16500 |
| 0.7564930555555556 | 14600 |
| 0.7565046296296297 | 20000 |
| 0.7565162037037036 | 21200 |
| 0.7565277777777778 | 18000 |
| 0.7565393518518518 | 14400 |
| 0.756550925925926 | 54300 |
| 0.7565624999999999 | 41600 |
| 0.7565740740740741 | 43600 |
| 0.7565856481481482 | 36500 |
| 0.7565972222222223 | 25600 |
| 0.7566087962962963 | 29200 |
| 0.7566203703703703 | 36200 |
| 0.7566319444444445 | 63300 |
| 0.7566435185185184 | 63600 |
| 0.7566550925925926 | 37600 |
| 0.7566666666666667 | 31800 |
| 0.7566782407407407 | 25600 |
| 0.7566898148148148 | 20400 |
| 0.7567013888888888 | 21200 |
| 0.756712962962963 | 22600 |
| 0.7567245370370371 | 23200 |
| 0.756736111111111 | 23900 |
| 0.7567476851851852 | 22600 |
| 0.7567592592592592 | 22700 |
| 0.7567708333333334 | 23100 |
| 0.7567824074074073 | 20100 |
| 0.7567939814814815 | 10400 |
| 0.7568055555555556 | 8490 |
| 0.7568171296296297 | 8020 |
| 0.7568287037037037 | 7540 |
| 0.7568402777777777 | 7190 |
| 0.7568518518518519 | 7150 |
| 0.756863425925926 | 7230 |
| 0.756875 | 7230 |
| 0.7568865740740741 | 7160 |
| 0.7568981481481482 | 7140 |
| 0.7569097222222222 | 7220 |
| 0.7569212962962962 | 7150 |
| 0.7569328703703704 | 7180 |
| 0.7569444444444445 | 7260 |
| 0.7569560185185185 | 7110 |
| 0.7569675925925926 | 7140 |
| 0.7569791666666666 | 7110 |
| 0.7569907407407408 | 7130 |
| 0.7570023148148147 | 7140 |
| 0.7570138888888889 | 7070 |
| 0.757025462962963 | 6850 |
| 0.7570370370370371 | 6210 |
| 0.7570486111111111 | 5980 |
| 0.7570601851851851 | 5790 |
| 0.7570717592592593 | 5900 |
| 0.7570833333333334 | 4820 |
| 0.7570949074074074 | 3700 |
| 0.7571064814814815 | 3640 |
| 0.7571180555555556 | 3640 |
| 0.7571296296296296 | 3600 |
| 0.7571412037037036 | 3620 |
| 0.7571527777777778 | 3700 |
| 0.7571643518518519 | 3730 |